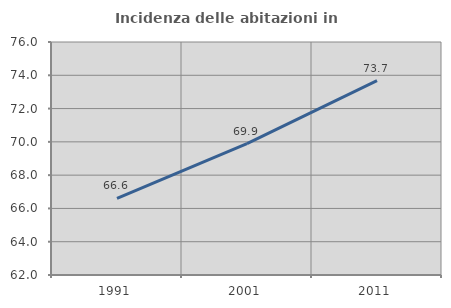
| Category | Incidenza delle abitazioni in proprietà  |
|---|---|
| 1991.0 | 66.605 |
| 2001.0 | 69.896 |
| 2011.0 | 73.675 |